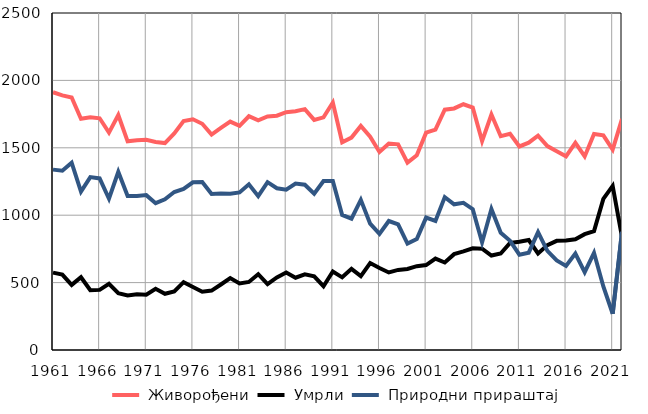
| Category |  Живорођени |  Умрли |  Природни прираштај |
|---|---|---|---|
| 1961.0 | 1912 | 574 | 1338 |
| 1962.0 | 1889 | 559 | 1330 |
| 1963.0 | 1873 | 483 | 1390 |
| 1964.0 | 1715 | 540 | 1175 |
| 1965.0 | 1727 | 444 | 1283 |
| 1966.0 | 1719 | 446 | 1273 |
| 1967.0 | 1613 | 491 | 1122 |
| 1968.0 | 1743 | 421 | 1322 |
| 1969.0 | 1548 | 405 | 1143 |
| 1970.0 | 1556 | 414 | 1142 |
| 1971.0 | 1559 | 410 | 1149 |
| 1972.0 | 1543 | 454 | 1089 |
| 1973.0 | 1535 | 417 | 1118 |
| 1974.0 | 1607 | 435 | 1172 |
| 1975.0 | 1698 | 503 | 1195 |
| 1976.0 | 1712 | 468 | 1244 |
| 1977.0 | 1678 | 432 | 1246 |
| 1978.0 | 1598 | 441 | 1157 |
| 1979.0 | 1647 | 486 | 1161 |
| 1980.0 | 1694 | 534 | 1160 |
| 1981.0 | 1663 | 494 | 1169 |
| 1982.0 | 1734 | 505 | 1229 |
| 1983.0 | 1703 | 562 | 1141 |
| 1984.0 | 1733 | 488 | 1245 |
| 1985.0 | 1738 | 538 | 1200 |
| 1986.0 | 1764 | 575 | 1189 |
| 1987.0 | 1771 | 536 | 1235 |
| 1988.0 | 1787 | 561 | 1226 |
| 1989.0 | 1707 | 547 | 1160 |
| 1990.0 | 1726 | 473 | 1253 |
| 1991.0 | 1836 | 582 | 1254 |
| 1992.0 | 1541 | 539 | 1002 |
| 1993.0 | 1576 | 602 | 974 |
| 1994.0 | 1662 | 548 | 1114 |
| 1995.0 | 1582 | 645 | 937 |
| 1996.0 | 1469 | 608 | 861 |
| 1997.0 | 1532 | 575 | 957 |
| 1998.0 | 1526 | 594 | 932 |
| 1999.0 | 1390 | 601 | 789 |
| 2000.0 | 1445 | 622 | 823 |
| 2001.0 | 1612 | 630 | 982 |
| 2002.0 | 1635 | 678 | 957 |
| 2003.0 | 1783 | 649 | 1134 |
| 2004.0 | 1792 | 711 | 1081 |
| 2005.0 | 1823 | 731 | 1092 |
| 2006.0 | 1799 | 754 | 1045 |
| 2007.0 | 1550 | 752 | 798 |
| 2008.0 | 1747 | 701 | 1046 |
| 2009.0 | 1586 | 716 | 870 |
| 2010.0 | 1604 | 794 | 810 |
| 2011.0 | 1510 | 803 | 707 |
| 2012.0 | 1538 | 816 | 722 |
| 2013.0 | 1590 | 716 | 874 |
| 2014.0 | 1513 | 778 | 735 |
| 2015.0 | 1475 | 810 | 665 |
| 2016.0 | 1437 | 813 | 624 |
| 2017.0 | 1537 | 822 | 715 |
| 2018.0 | 1436 | 859 | 577 |
| 2019.0 | 1603 | 882 | 721 |
| 2020.0 | 1592 | 1121 | 471 |
| 2021.0 | 1486 | 1217 | 269 |
| 2022.0 | 1714 | 838 | 876 |